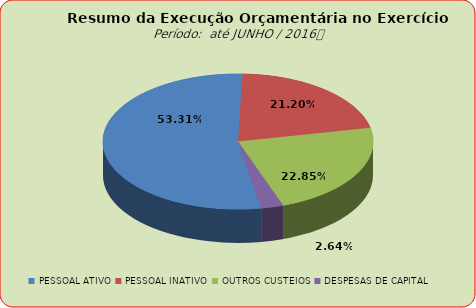
| Category | Series 0 |
|---|---|
| PESSOAL ATIVO | 67483619.68 |
| PESSOAL INATIVO | 26834805.37 |
| OUTROS CUSTEIOS | 28932668.91 |
| DESPESAS DE CAPITAL | 3344670.38 |